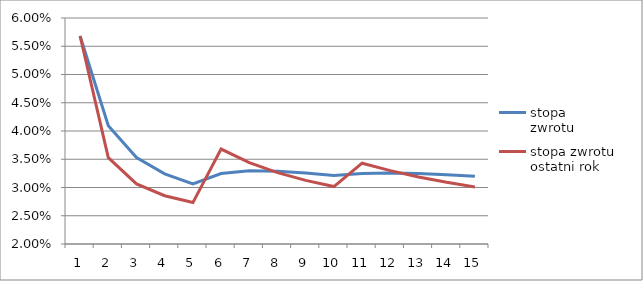
| Category | stopa_x000d_zwrotu | stopa zwrotu_x000d_ostatni rok |
|---|---|---|
| 1.0 | 0.057 | 0.057 |
| 2.0 | 0.041 | 0.035 |
| 3.0 | 0.035 | 0.031 |
| 4.0 | 0.032 | 0.029 |
| 5.0 | 0.031 | 0.027 |
| 6.0 | 0.032 | 0.037 |
| 7.0 | 0.033 | 0.034 |
| 8.0 | 0.033 | 0.033 |
| 9.0 | 0.033 | 0.031 |
| 10.0 | 0.032 | 0.03 |
| 11.0 | 0.032 | 0.034 |
| 12.0 | 0.033 | 0.033 |
| 13.0 | 0.032 | 0.032 |
| 14.0 | 0.032 | 0.031 |
| 15.0 | 0.032 | 0.03 |